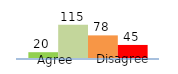
| Category | Series 0 | Series 1 | Series 2 | Series 3 |
|---|---|---|---|---|
| 0 | 20 | 115 | 78 | 45 |